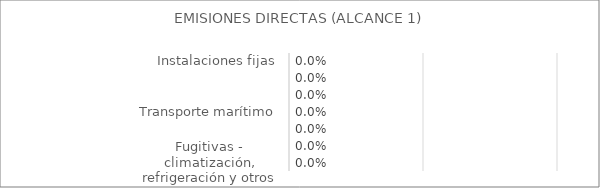
| Category | Series 0 |
|---|---|
| Instalaciones fijas | 0 |
| Transporte por carretera | 0 |
| Transporte ferroviario | 0 |
| Transporte marítimo | 0 |
| Transporte aéreo | 0 |
| Funcionamiento de maquinaria | 0 |
| Fugitivas - climatización, refrigeración y otros | 0 |